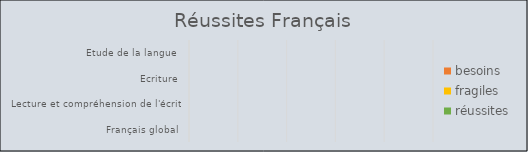
| Category | besoins | fragiles | réussites |
|---|---|---|---|
| Français global | 0 | 0 | 0 |
| Lecture et compréhension de l'écrit | 0 | 0 | 0 |
| Ecriture | 0 | 0 | 0 |
| Etude de la langue  | 0 | 0 | 0 |